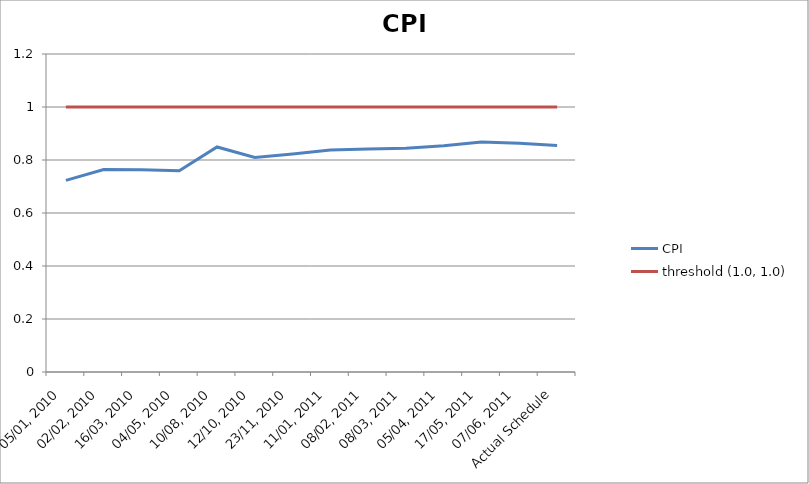
| Category | CPI | threshold (1.0, 1.0) |
|---|---|---|
| 05/01, 2010 | 0.723 | 1 |
| 02/02, 2010 | 0.764 | 1 |
| 16/03, 2010 | 0.763 | 1 |
| 04/05, 2010 | 0.759 | 1 |
| 10/08, 2010 | 0.849 | 1 |
| 12/10, 2010 | 0.81 | 1 |
| 23/11, 2010 | 0.823 | 1 |
| 11/01, 2011 | 0.838 | 1 |
| 08/02, 2011 | 0.841 | 1 |
| 08/03, 2011 | 0.845 | 1 |
| 05/04, 2011 | 0.854 | 1 |
| 17/05, 2011 | 0.868 | 1 |
| 07/06, 2011 | 0.863 | 1 |
| Actual Schedule | 0.855 | 1 |